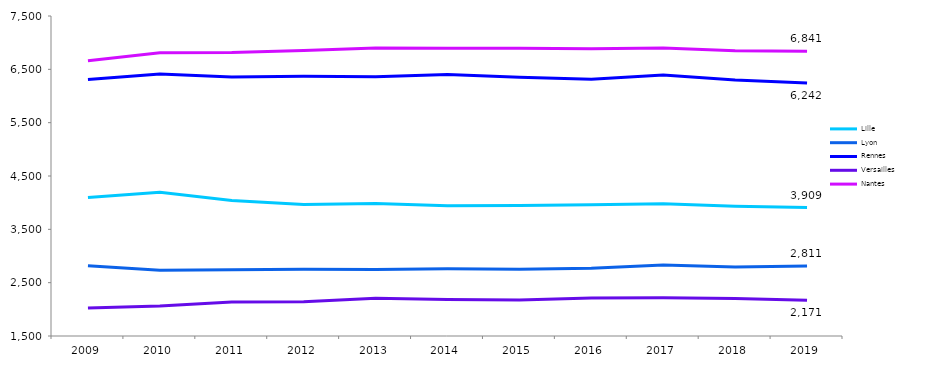
| Category | Lille | Lyon | Rennes | Versailles | Nantes |
|---|---|---|---|---|---|
| 2009.0 | 4099 | 2816 | 6311 | 2024 | 6659 |
| 2010.0 | 4194 | 2735 | 6412 | 2061 | 6809 |
| 2011.0 | 4041 | 2740 | 6357 | 2136 | 6814 |
| 2012.0 | 3967 | 2750 | 6371 | 2143 | 6852 |
| 2013.0 | 3986 | 2745 | 6362 | 2207 | 6901 |
| 2014.0 | 3941 | 2760 | 6405 | 2186 | 6896 |
| 2015.0 | 3948 | 2751 | 6353 | 2177 | 6894 |
| 2016.0 | 3963 | 2770 | 6314 | 2213 | 6885 |
| 2017.0 | 3979 | 2829 | 6396 | 2215 | 6898 |
| 2018.0 | 3933 | 2794 | 6300 | 2201 | 6847 |
| 2019.0 | 3909 | 2811 | 6242 | 2171 | 6841 |